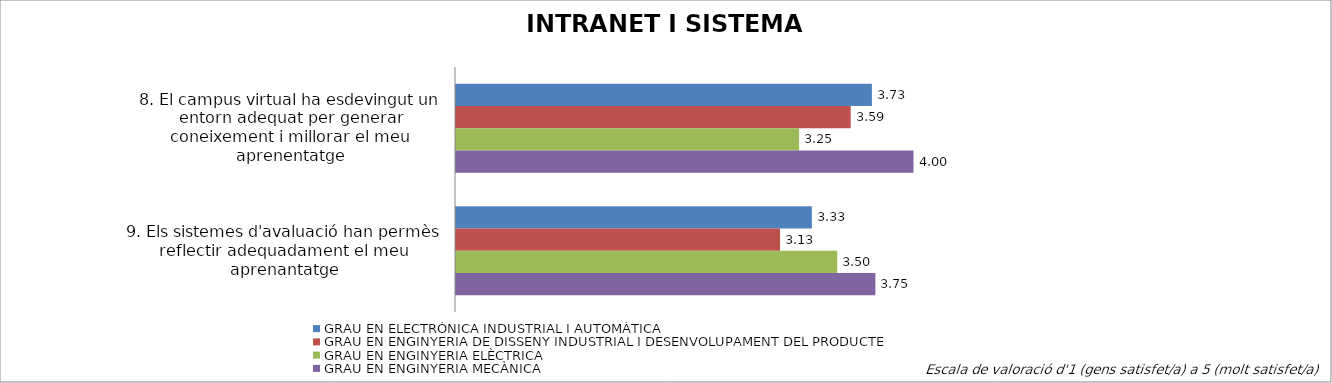
| Category | GRAU EN ELECTRÒNICA INDUSTRIAL I AUTOMÀTICA | GRAU EN ENGINYERIA DE DISSENY INDUSTRIAL I DESENVOLUPAMENT DEL PRODUCTE | GRAU EN ENGINYERIA ELÈCTRICA | GRAU EN ENGINYERIA MECÀNICA |
|---|---|---|---|---|
| 8. El campus virtual ha esdevingut un entorn adequat per generar coneixement i millorar el meu aprenentatge | 3.727 | 3.588 | 3.25 | 4 |
| 9. Els sistemes d'avaluació han permès reflectir adequadament el meu aprenantatge | 3.333 | 3.125 | 3.5 | 3.75 |